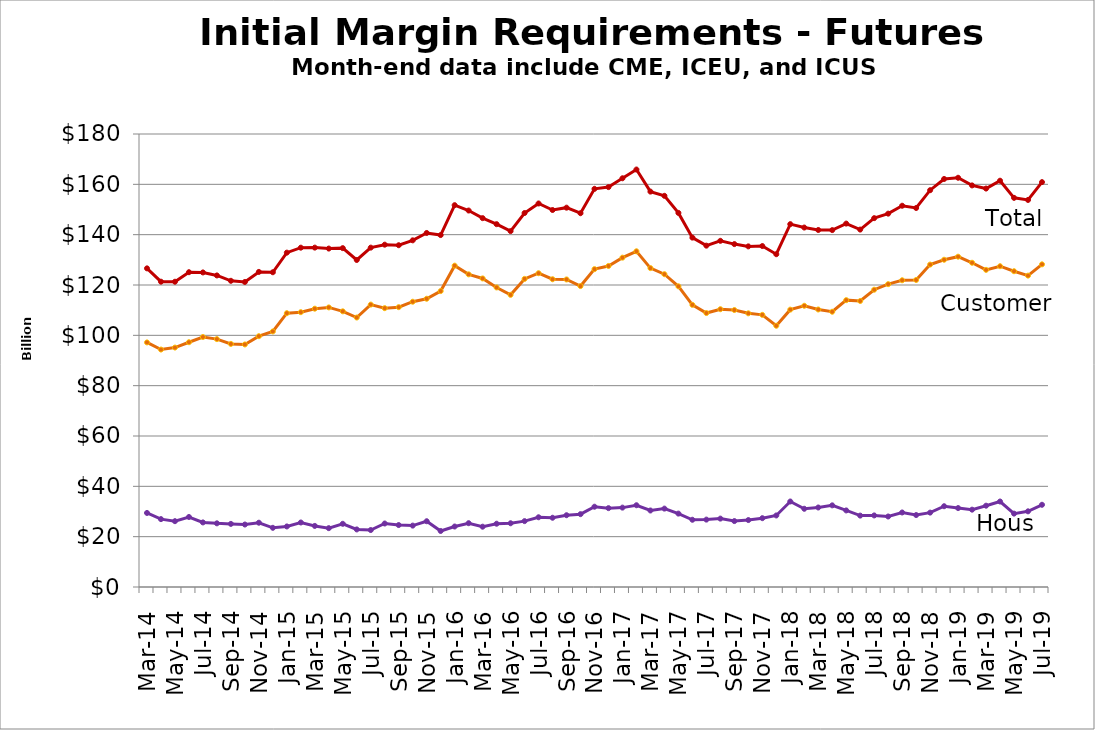
| Category | Customer | House | Total |
|---|---|---|---|
| Mar-14 |  |  |  |
|   |  |  |  |
| May-14 |  |  |  |
|    |  |  |  |
| Jul-14 |  |  |  |
|   |  |  |  |
| Sep-14 |  |  |  |
|   |  |  |  |
| Nov-14 |  |  |  |
|   |  |  |  |
| Jan-15 |  |  |  |
|   |  |  |  |
| Mar-15 |  |  |  |
|   |  |  |  |
| May-15 |  |  |  |
|   |  |  |  |
| Jul-15 |  |  |  |
|   |  |  |  |
| Sep-15 |  |  |  |
|   |  |  |  |
| Nov-15 |  |  |  |
|   |  |  |  |
| Jan-16 |  |  |  |
|   |  |  |  |
| Mar-16 |  |  |  |
|   |  |  |  |
| May-16 |  |  |  |
|   |  |  |  |
| Jul-16 |  |  |  |
|   |  |  |  |
| Sep-16 |  |  |  |
|   |  |  |  |
| Nov-16 |  |  |  |
|   |  |  |  |
| Jan-17 |  |  |  |
|   |  |  |  |
| Mar-17 |  |  |  |
|   |  |  |  |
| May-17 |  |  |  |
|   |  |  |  |
| Jul-17 |  |  |  |
|   |  |  |  |
| Sep-17 |  |  |  |
|   |  |  |  |
| Nov-17 |  |  |  |
|   |  |  |  |
| Jan-18 |  |  |  |
|   |  |  |  |
| Mar-18 |  |  |  |
|   |  |  |  |
| May-18 |  |  |  |
|   |  |  |  |
| Jul-18 |  |  |  |
|   |  |  |  |
| Sep-18 |  |  |  |
|   |  |  |  |
| Nov-18 |  |  |  |
|   |  |  |  |
| Jan-19 |  |  |  |
|   |  |  |  |
| Mar-19 |  |  |  |
|   |  |  |  |
| May-19 |  |  |  |
|   |  |  |  |
| Jul-19 |  |  |  |